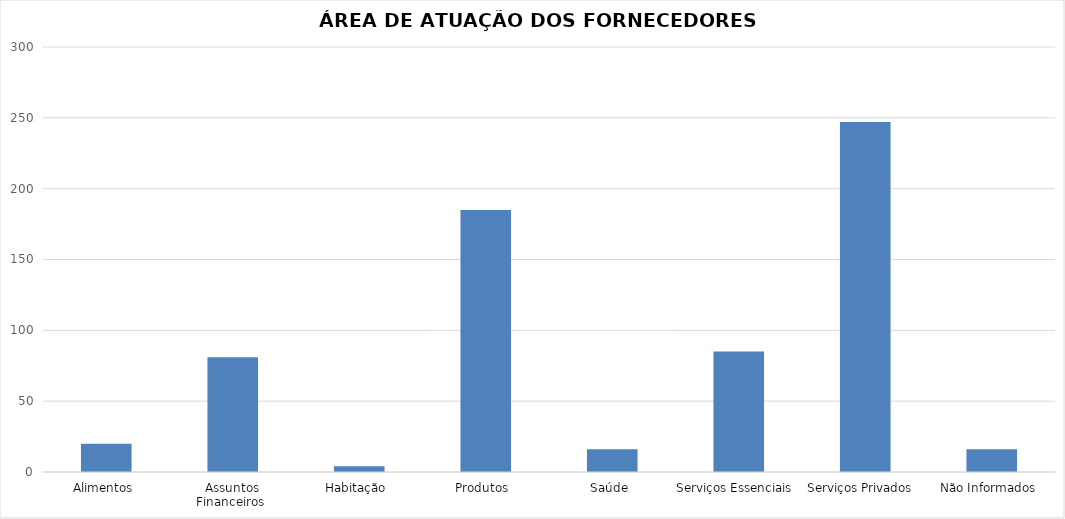
| Category | Series 0 |
|---|---|
| Alimentos  | 20 |
| Assuntos Financeiros  | 81 |
| Habitação  | 4 |
| Produtos  | 185 |
| Saúde  | 16 |
| Serviços Essenciais  | 85 |
| Serviços Privados   | 247 |
| Não Informados  | 16 |